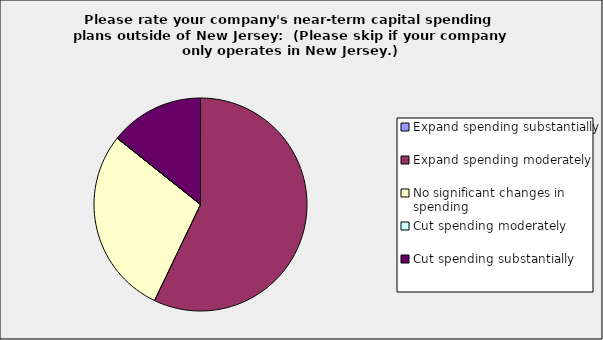
| Category | Series 0 |
|---|---|
| Expand spending substantially | 0 |
| Expand spending moderately | 0.571 |
| No significant changes in spending | 0.286 |
| Cut spending moderately | 0 |
| Cut spending substantially | 0.143 |